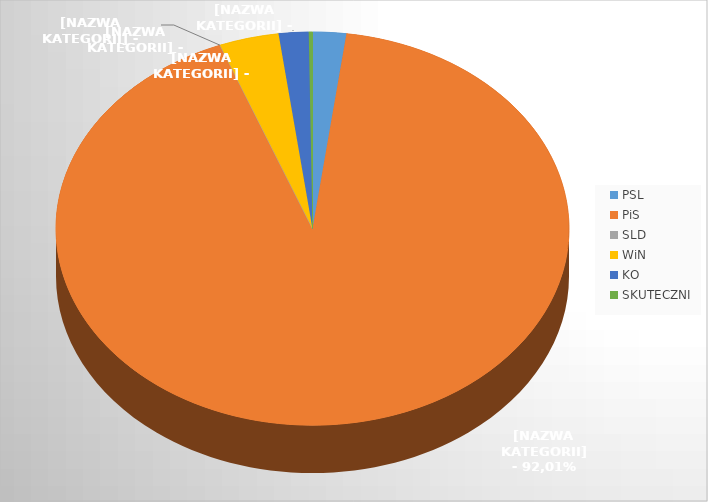
| Category | Series 0 |
|---|---|
| PSL | 9 |
| PiS | 392 |
| SLD | 0 |
| WiN | 16 |
| KO | 8 |
| SKUTECZNI | 1 |